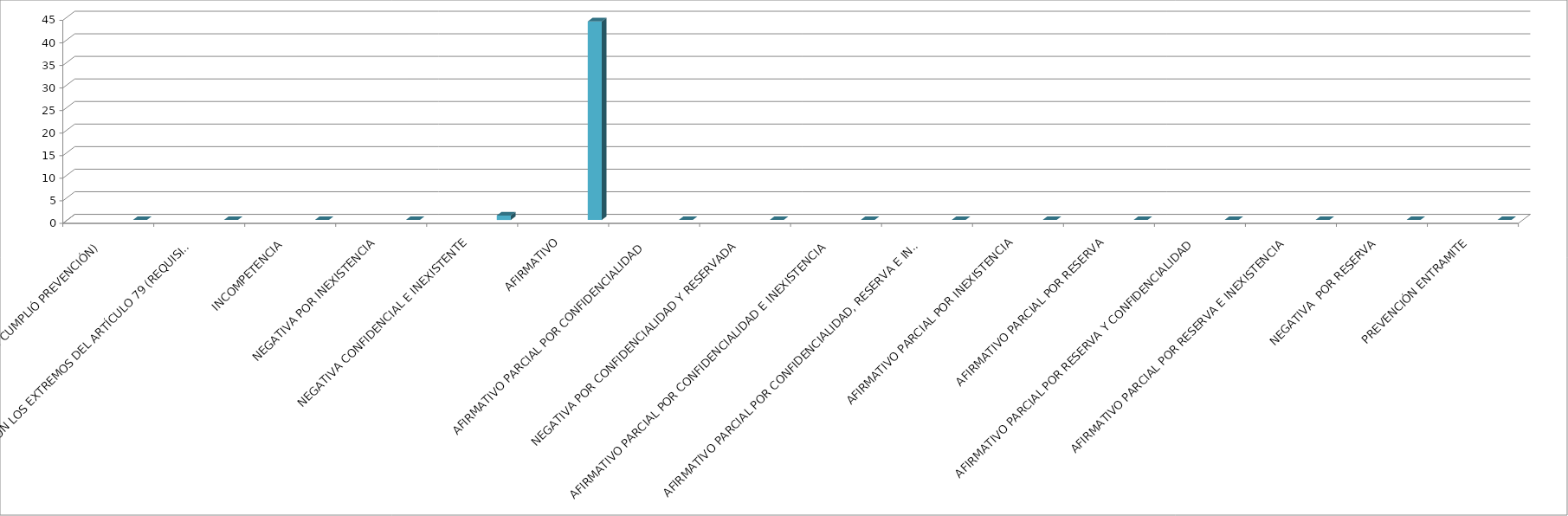
| Category | Series 0 | Series 1 | Series 2 | Series 3 | Series 4 |
|---|---|---|---|---|---|
| SE TIENE POR NO PRESENTADA ( NO CUMPLIÓ PREVENCIÓN) |  |  |  |  | 0 |
| NO CUMPLIO CON LOS EXTREMOS DEL ARTÍCULO 79 (REQUISITOS) |  |  |  |  | 0 |
| INCOMPETENCIA  |  |  |  |  | 0 |
| NEGATIVA POR INEXISTENCIA |  |  |  |  | 0 |
| NEGATIVA CONFIDENCIAL E INEXISTENTE |  |  |  |  | 1 |
| AFIRMATIVO |  |  |  |  | 44 |
| AFIRMATIVO PARCIAL POR CONFIDENCIALIDAD  |  |  |  |  | 0 |
| NEGATIVA POR CONFIDENCIALIDAD Y RESERVADA |  |  |  |  | 0 |
| AFIRMATIVO PARCIAL POR CONFIDENCIALIDAD E INEXISTENCIA |  |  |  |  | 0 |
| AFIRMATIVO PARCIAL POR CONFIDENCIALIDAD, RESERVA E INEXISTENCIA |  |  |  |  | 0 |
| AFIRMATIVO PARCIAL POR INEXISTENCIA |  |  |  |  | 0 |
| AFIRMATIVO PARCIAL POR RESERVA |  |  |  |  | 0 |
| AFIRMATIVO PARCIAL POR RESERVA Y CONFIDENCIALIDAD |  |  |  |  | 0 |
| AFIRMATIVO PARCIAL POR RESERVA E INEXISTENCIA |  |  |  |  | 0 |
| NEGATIVA  POR RESERVA |  |  |  |  | 0 |
| PREVENCIÓN ENTRAMITE |  |  |  |  | 0 |